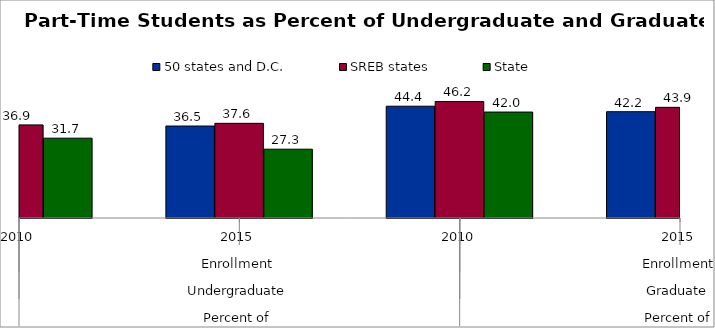
| Category | 50 states and D.C. | SREB states | State |
|---|---|---|---|
| 0 | 36.6 | 36.946 | 31.675 |
| 1 | 36.493 | 37.565 | 27.301 |
| 2 | 44.359 | 46.23 | 42.042 |
| 3 | 42.182 | 43.917 | 40.352 |